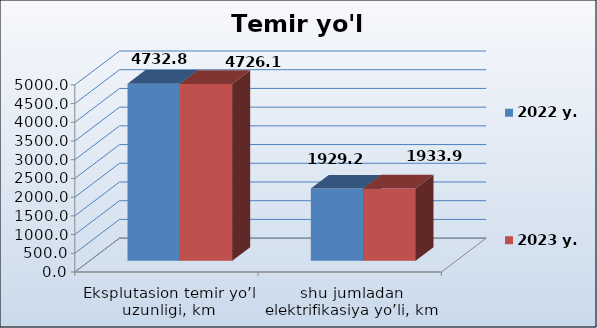
| Category | 2022 y. | 2023 y. |
|---|---|---|
| Eksplutasion temir yo’l uzunligi, km | 4732.8 | 4726.1 |
| shu jumladan elektrifikasiya yo’li, km | 1929.2 | 1933.9 |